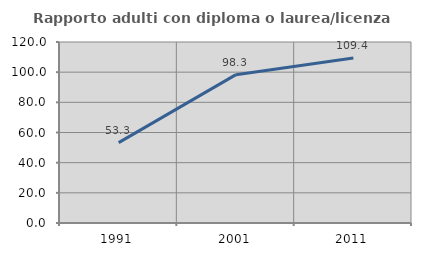
| Category | Rapporto adulti con diploma o laurea/licenza media  |
|---|---|
| 1991.0 | 53.312 |
| 2001.0 | 98.347 |
| 2011.0 | 109.42 |